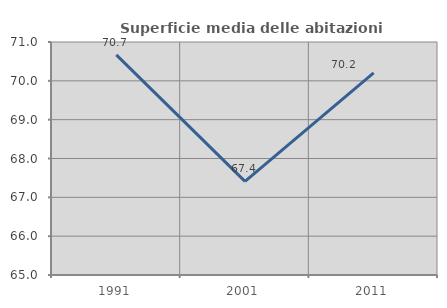
| Category | Superficie media delle abitazioni occupate |
|---|---|
| 1991.0 | 70.668 |
| 2001.0 | 67.412 |
| 2011.0 | 70.207 |